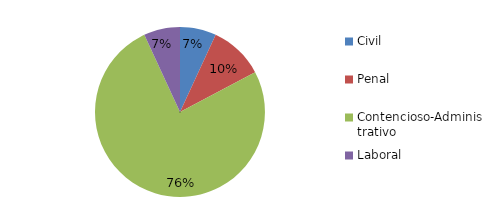
| Category | Series 0 |
|---|---|
| Civil | 2 |
| Penal | 3 |
| Contencioso-Administrativo | 22 |
| Laboral | 2 |